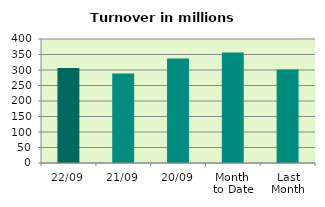
| Category | Series 0 |
|---|---|
| 22/09 | 306.156 |
| 21/09 | 288.945 |
| 20/09 | 337.456 |
| Month 
to Date | 356.656 |
| Last
Month | 301.741 |